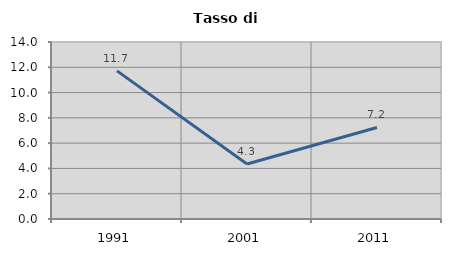
| Category | Tasso di disoccupazione   |
|---|---|
| 1991.0 | 11.717 |
| 2001.0 | 4.348 |
| 2011.0 | 7.24 |